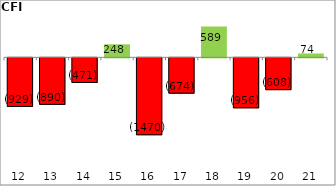
| Category | CFI |
|---|---|
| 2012-03-31 | -928.98 |
| 2013-03-31 | -889.79 |
| 2014-03-31 | -471.17 |
| 2015-03-31 | 248.34 |
| 2016-03-31 | -1469.94 |
| 2017-03-31 | -674.44 |
| 2018-03-31 | 589.29 |
| 2019-03-31 | -955.73 |
| 2020-03-31 | -608.24 |
| 2021-03-31 | 73.8 |